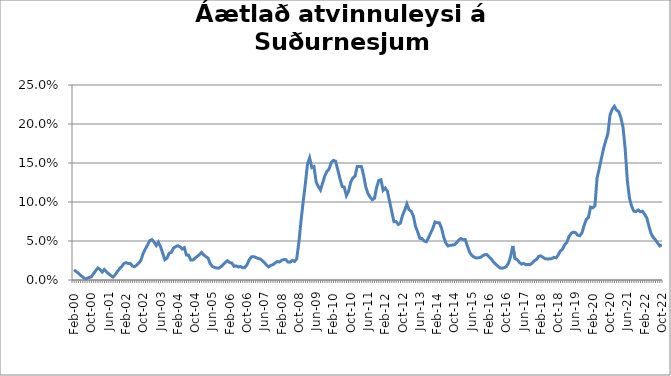
| Category | Series 0 |
|---|---|
| feb.00 | 0.013 |
| mar.00 | 0.011 |
| apr.00 | 0.009 |
| maí.00 | 0.006 |
| jún.00 | 0.004 |
| júl.00 | 0.002 |
| ágú.00 | 0.002 |
| sep.00 | 0.003 |
| okt.00 | 0.004 |
| nóv.00 | 0.008 |
| des.00 | 0.012 |
| jan.01 | 0.015 |
| feb.01 | 0.013 |
| mar.01 | 0.01 |
| apr.01 | 0.013 |
| maí.01 | 0.011 |
| jún.01 | 0.008 |
| júl.01 | 0.006 |
| ágú.01 | 0.004 |
| sep.01 | 0.007 |
| okt.01 | 0.011 |
| nóv.01 | 0.014 |
| des.01 | 0.017 |
| jan.02 | 0.021 |
| feb.02 | 0.022 |
| mar.02 | 0.021 |
| apr.02 | 0.021 |
| maí.02 | 0.018 |
| jún.02 | 0.017 |
| júl.02 | 0.019 |
| ágú.02 | 0.022 |
| sep.02 | 0.026 |
| okt.02 | 0.034 |
| nóv.02 | 0.04 |
| des.02 | 0.045 |
| jan.03 | 0.05 |
| feb.03 | 0.052 |
| mar.03 | 0.049 |
| apr.03 | 0.044 |
| maí.03 | 0.049 |
| jún.03 | 0.043 |
| júl.03 | 0.034 |
| ágú.03 | 0.026 |
| sep.03 | 0.028 |
| okt.03 | 0.034 |
| nóv.03 | 0.035 |
| des.03 | 0.041 |
| jan.04 | 0.043 |
| feb.04 | 0.044 |
| mar.04 | 0.043 |
| apr.04 | 0.04 |
| maí.04 | 0.041 |
| jún.04 | 0.032 |
| júl.04 | 0.032 |
| ágú.04 | 0.026 |
| sep.04 | 0.026 |
| okt.04 | 0.028 |
| nóv.04 | 0.03 |
| des.04 | 0.032 |
| jan.05 | 0.035 |
| feb.05 | 0.032 |
| mar.05 | 0.03 |
| apr.05 | 0.028 |
| maí.05 | 0.021 |
| jún.05 | 0.018 |
| júl.05 | 0.016 |
| ágú.05 | 0.015 |
| sep.05 | 0.015 |
| okt.05 | 0.017 |
| nóv.05 | 0.02 |
| des.05 | 0.023 |
| jan.06 | 0.025 |
| feb.06 | 0.022 |
| mar.06 | 0.022 |
| apr.06 | 0.018 |
| maí.06 | 0.018 |
| jún.06 | 0.017 |
| júl.06 | 0.017 |
| ágú.06 | 0.016 |
| sep.06 | 0.016 |
| okt.06 | 0.019 |
| nóv.06 | 0.026 |
| des.06 | 0.03 |
| jan.07 | 0.03 |
| feb.07 | 0.029 |
| mar.07 | 0.028 |
| apr.07 | 0.027 |
| maí.07 | 0.025 |
| jún.07 | 0.022 |
| júl.07 | 0.019 |
| ágú.07 | 0.017 |
| sep.07 | 0.019 |
| okt.07 | 0.02 |
| nóv.07 | 0.022 |
| des.07 | 0.024 |
| jan.08 | 0.023 |
| feb.08 | 0.025 |
| mar.08 | 0.026 |
| apr.08 | 0.026 |
| maí.08 | 0.023 |
| jún.08 | 0.023 |
| júl.08 | 0.025 |
| ágú.08 | 0.024 |
| sep.08 | 0.027 |
| okt.08 | 0.048 |
| nóv.08 | 0.075 |
| des.08 | 0.1 |
| jan.09 | 0.123 |
| feb.09 | 0.149 |
| mar.09 | 0.157 |
| apr.09 | 0.144 |
| maí.09 | 0.145 |
| jún.09 | 0.126 |
| júl.09 | 0.12 |
| ágú.09 | 0.115 |
| sep.09 | 0.124 |
| okt.09 | 0.133 |
| nóv.09 | 0.139 |
| des.09 | 0.142 |
| jan.10 | 0.151 |
| feb.10 | 0.153 |
| mar.10 | 0.152 |
| apr.10 | 0.141 |
| maí.10 | 0.13 |
| jún.10 | 0.12 |
| júl.10 | 0.119 |
| ágú.10 | 0.108 |
| sep.10 | 0.114 |
| okt.10 | 0.125 |
| nóv.10 | 0.131 |
| des.10 | 0.133 |
| jan.11 | 0.145 |
| feb.11 | 0.146 |
| mar.11 | 0.145 |
| apr.11 | 0.134 |
| maí.11 | 0.119 |
| jún.11 | 0.111 |
| júl.11 | 0.106 |
| ágú.11 | 0.103 |
| sep.11 | 0.105 |
| okt.11 | 0.119 |
| nóv.11 | 0.128 |
| des.11 | 0.128 |
| jan.12 | 0.115 |
| feb.12 | 0.118 |
| mar.12 | 0.114 |
| apr.12 | 0.101 |
| maí.12 | 0.088 |
| jún.12 | 0.075 |
| júl.12 | 0.075 |
| ágú.12 | 0.071 |
| sep.12 | 0.073 |
| okt.12 | 0.083 |
| nóv.12 | 0.09 |
| des.12 | 0.098 |
| jan.13 | 0.09 |
| feb.13 | 0.088 |
| mar.13 | 0.082 |
| apr.13 | 0.069 |
| maí.13 | 0.061 |
| jún.13 | 0.053 |
| júl.13 | 0.053 |
| ágú.13 | 0.05 |
| sep.13 | 0.049 |
| okt.13 | 0.054 |
| nóv.13 | 0.06 |
| des.13 | 0.066 |
| jan.14 | 0.074 |
| feb.14 | 0.073 |
| mar.14 | 0.073 |
| apr.14 | 0.067 |
| maí.14 | 0.055 |
| jún.14 | 0.048 |
| júl.14 | 0.044 |
| ágú.14 | 0.044 |
| sep.14 | 0.045 |
| okt.14 | 0.045 |
| nóv.14*** | 0.048 |
| des.14 | 0.051 |
| jan.15 | 0.053 |
| feb.15 | 0.052 |
| mar.15 | 0.052 |
| apr.15 | 0.044 |
| maí.15 | 0.036 |
| jún.15 | 0.032 |
| júl.15 | 0.03 |
| ágú.15 | 0.028 |
| sep.15 | 0.028 |
| okt.15 | 0.029 |
| nóv.15 | 0.031 |
| des.15 | 0.032 |
| jan.16 | 0.033 |
| feb.16 | 0.03 |
| mar.16 | 0.027 |
| apr.16 | 0.023 |
| maí.16 | 0.02 |
| jún.16 | 0.018 |
| júl.16 | 0.015 |
| ágú.16 | 0.015 |
| sep.16 | 0.016 |
| okt.16 | 0.017 |
| nóv.16 | 0.022 |
| des.16 | 0.03 |
| jan.17 | 0.044 |
| feb.17 | 0.028 |
| mar.17 | 0.026 |
| apr.17 | 0.023 |
| maí.17 | 0.02 |
| jún.17 | 0.021 |
| júl.17 | 0.02 |
| ágú.17 | 0.02 |
| sep.17 | 0.02 |
| okt.17 | 0.022 |
| nóv.17 | 0.025 |
| des.17 | 0.026 |
| jan.18 | 0.03 |
| feb.18 | 0.031 |
| mar.18 | 0.029 |
| apr.18 | 0.027 |
| maí.18 | 0.027 |
| jún.18 | 0.027 |
| júl.18 | 0.027 |
| ágú.18 | 0.029 |
| sep.18 | 0.028 |
| okt.18 | 0.032 |
| nóv.18 | 0.037 |
| des.18 | 0.039 |
| jan.19 | 0.045 |
| feb.19 | 0.048 |
| mar.19 | 0.056 |
| apr.19 | 0.06 |
| maí.19 | 0.061 |
| jún.19 | 0.061 |
| júl.19 | 0.057 |
| ágú.19 | 0.057 |
| sep.19 | 0.06 |
| okt.19 | 0.07 |
| nóv.19 | 0.078 |
| des.19 | 0.08 |
| jan.20 | 0.094 |
| feb.20 | 0.093 |
| mars 2020* | 0.095 |
| apr.20 | 0.131 |
| maí.20 | 0.143 |
| jún.20 | 0.156 |
| júl.20 | 0.169 |
| ágú.20 | 0.178 |
| sep.20 | 0.188 |
| okt.20 | 0.212 |
| nóv.20 | 0.219 |
| des.20 | 0.223 |
| jan.21 | 0.218 |
| feb.21 | 0.216 |
| mar.21 | 0.208 |
| apr.21 | 0.196 |
| maí.21 | 0.168 |
| jún.21 | 0.127 |
| júl.21 | 0.105 |
| ágú.21 | 0.094 |
| sep.21 | 0.088 |
| okt.21 | 0.088 |
| nóv.21 | 0.09 |
| des.21 | 0.088 |
| jan.22 | 0.088 |
| feb.22 | 0.084 |
| mar.22 | 0.08 |
| apr.22 | 0.069 |
| maí.22 | 0.059 |
| jún.22 | 0.055 |
| júl.22 | 0.051 |
| ágú.22 | 0.047 |
| sep.22 | 0.044 |
| okt.22 | 0.045 |